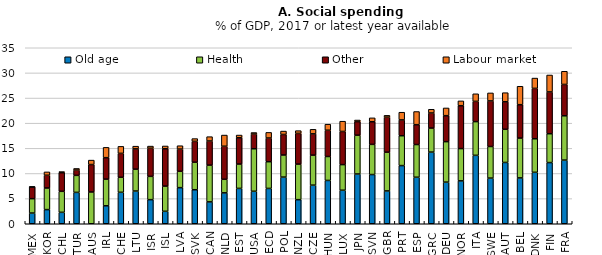
| Category | Old age | Health | Other | Labour market |
|---|---|---|---|---|
| MEX | 2.127 | 2.862 | 2.338 | 0.007 |
| KOR | 2.815 | 4.295 | 2.536 | 0.666 |
| CHL | 2.274 | 4.176 | 3.706 | 0.218 |
| TUR | 6.237 | 3.384 | 1.061 | 0.315 |
| AUS | 0 | 6.32 | 5.456 | 0.882 |
| IRL | 3.573 | 5.301 | 4.268 | 2.051 |
| CHE | 6.257 | 2.99 | 4.751 | 1.393 |
| LTU | 6.507 | 4.348 | 4.041 | 0.533 |
| ISR | 4.792 | 4.632 | 5.588 | 0.432 |
| ISL | 2.475 | 5.011 | 7.431 | 0.55 |
| LVA | 7.179 | 3.257 | 4.411 | 0.672 |
| SVK | 6.762 | 5.475 | 4.147 | 0.552 |
| CAN | 4.351 | 7.308 | 4.795 | 0.864 |
| NLD | 6.144 | 2.701 | 6.572 | 2.222 |
| EST | 7.034 | 4.837 | 5.223 | 0.546 |
| USA | 6.462 | 8.455 | 2.927 | 0.299 |
| OECD | 7.028 | 5.313 | 4.706 | 1.12 |
| POL | 9.281 | 4.391 | 4.081 | 0.679 |
| NZL | 4.789 | 7.073 | 6.11 | 0.542 |
| CZE | 7.679 | 5.966 | 4.232 | 0.905 |
| HUN | 8.615 | 4.761 | 5.222 | 1.2 |
| LUX | 6.666 | 5.098 | 6.588 | 2.043 |
| JPN | 9.899 | 7.713 | 2.697 | 0.318 |
| SVN | 9.787 | 5.998 | 4.5 | 0.773 |
| GBR | 6.529 | 7.703 | 6.966 | 0.361 |
| PRT | 11.568 | 5.936 | 3.149 | 1.528 |
| ESP | 9.251 | 6.501 | 3.948 | 2.618 |
| GRC | 14.252 | 4.776 | 2.995 | 0.741 |
| DEU | 8.275 | 8.053 | 5.165 | 1.536 |
| NOR | 8.53 | 6.422 | 8.522 | 0.961 |
| ITA | 13.608 | 6.702 | 4.026 | 1.507 |
| SWE | 9.079 | 6.286 | 9.058 | 1.596 |
| AUT | 12.191 | 6.597 | 5.461 | 1.817 |
| BEL | 9.117 | 7.923 | 6.639 | 3.666 |
| DNK | 10.23 | 6.672 | 10.017 | 2.052 |
| FIN | 12.167 | 5.736 | 8.307 | 3.373 |
| FRA | 12.661 | 8.808 | 6.234 | 2.621 |